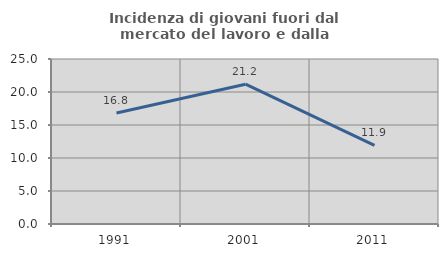
| Category | Incidenza di giovani fuori dal mercato del lavoro e dalla formazione  |
|---|---|
| 1991.0 | 16.821 |
| 2001.0 | 21.179 |
| 2011.0 | 11.928 |